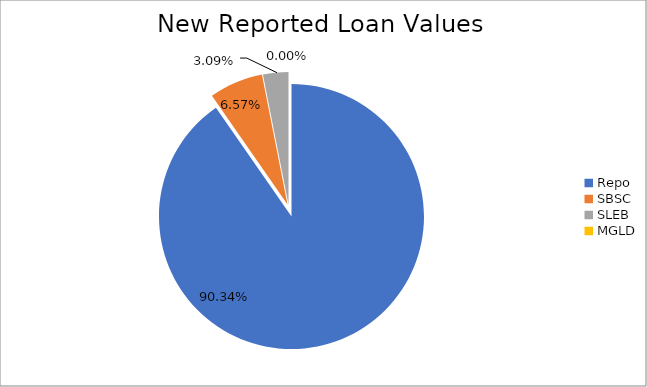
| Category | Series 0 |
|---|---|
| Repo | 12542546.637 |
| SBSC | 911602.825 |
| SLEB | 428996.498 |
| MGLD | 332.199 |